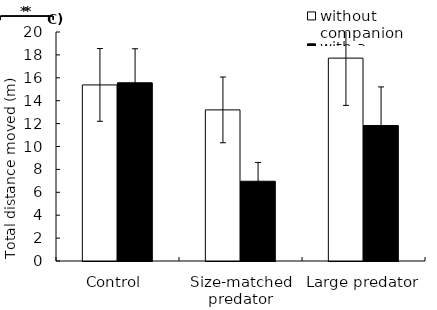
| Category | without companion | with a companion |
|---|---|---|
| Control  | 15.378 | 15.568 |
| Size-matched predator | 13.198 | 6.966 |
| Large predator | 17.717 | 11.834 |